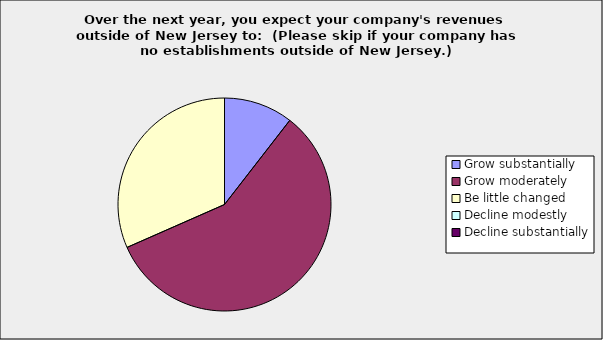
| Category | Series 0 |
|---|---|
| Grow substantially | 0.105 |
| Grow moderately | 0.579 |
| Be little changed | 0.316 |
| Decline modestly | 0 |
| Decline substantially | 0 |